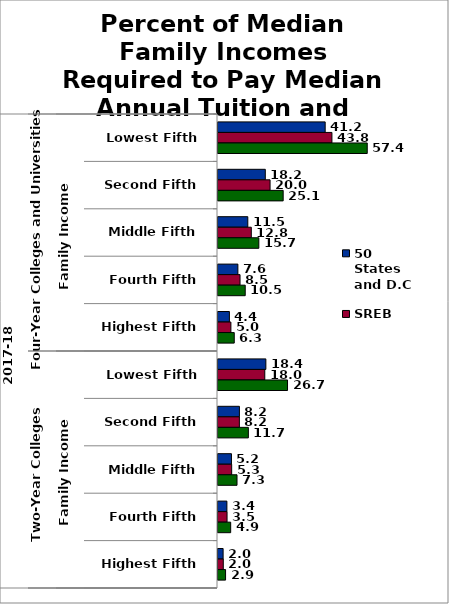
| Category | 50 States and D.C. | SREB states | State |
|---|---|---|---|
| 0 | 41.223 | 43.819 | 57.4 |
| 1 | 18.192 | 20.028 | 25.067 |
| 2 | 11.464 | 12.811 | 15.708 |
| 3 | 7.649 | 8.478 | 10.472 |
| 4 | 4.381 | 4.96 | 6.254 |
| 5 | 18.412 | 17.998 | 26.741 |
| 6 | 8.239 | 8.226 | 11.678 |
| 7 | 5.177 | 5.262 | 7.318 |
| 8 | 3.424 | 3.482 | 4.879 |
| 9 | 1.968 | 2.037 | 2.914 |